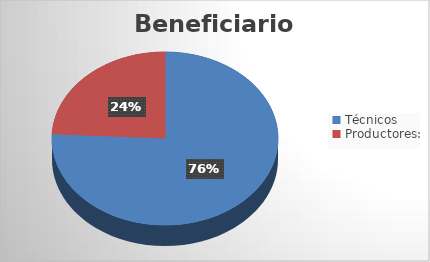
| Category | Series 0 |
|---|---|
| Técnicos | 25 |
| Productores: | 8 |